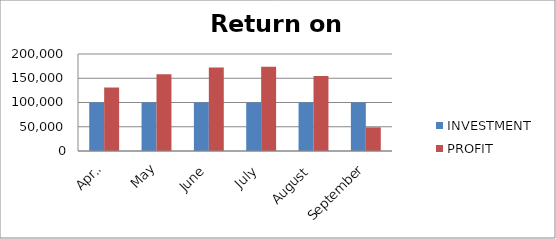
| Category | INVESTMENT  | PROFIT |
|---|---|---|
| April | 100000 | 130907 |
| May | 100000 | 158415 |
| June | 100000 | 172357 |
| July | 100000 | 173565 |
| August | 100000 | 154755 |
| September | 100000 | 48765 |